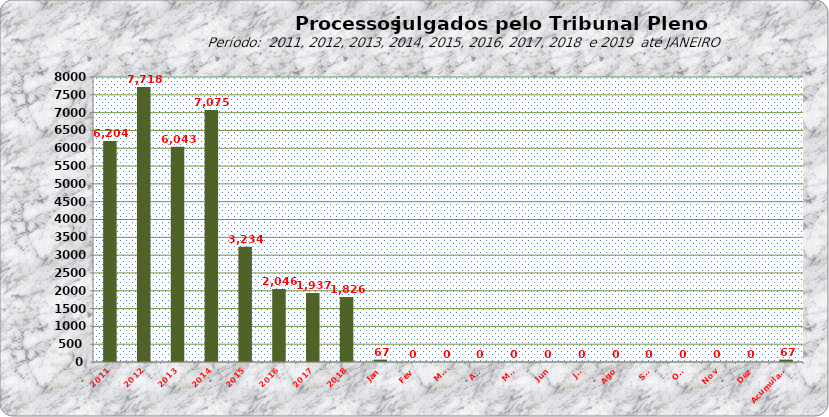
| Category | Series 0 |
|---|---|
| 2011 | 6204 |
| 2012 | 7718 |
| 2013 | 6043 |
| 2014 | 7075 |
| 2015 | 3234 |
| 2016 | 2046 |
| 2017 | 1937 |
| 2018 | 1826 |
| Jan | 67 |
| Fev | 0 |
| Mar | 0 |
| Abr | 0 |
| Mai | 0 |
| Jun | 0 |
| Jul | 0 |
| Ago | 0 |
| Set | 0 |
| Out | 0 |
| Nov | 0 |
| Dez | 0 |
| Acumulado | 67 |